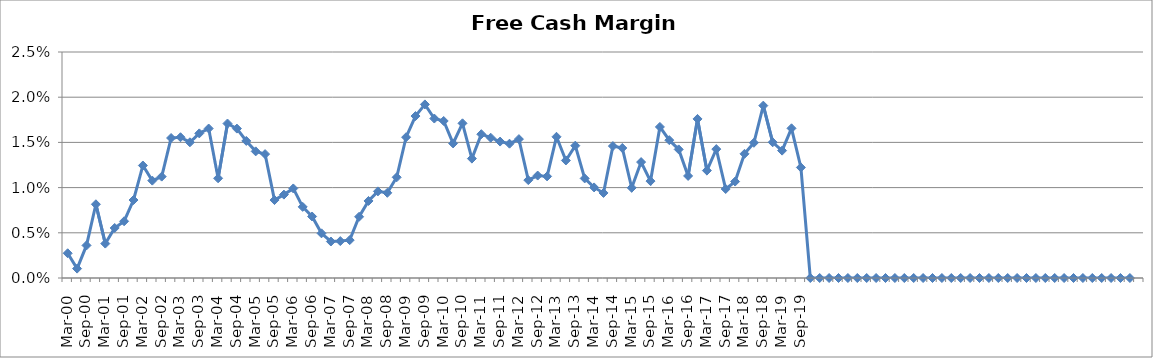
| Category | Revenue ($Millions) |
|---|---|
| Mar-00 | 0.003 |
| Jun-00 | 0.001 |
| Sep-00 | 0.004 |
| Dec-00 | 0.008 |
| Mar-01 | 0.004 |
| Jun-01 | 0.006 |
| Sep-01 | 0.006 |
| Dec-01 | 0.009 |
| Mar-02 | 0.012 |
| Jun-02 | 0.011 |
| Sep-02 | 0.011 |
| Dec-02 | 0.015 |
| Mar-03 | 0.016 |
| Jun-03 | 0.015 |
| Sep-03 | 0.016 |
| Dec-03 | 0.017 |
| Mar-04 | 0.011 |
| Jun-04 | 0.017 |
| Sep-04 | 0.017 |
| Dec-04 | 0.015 |
| Mar-05 | 0.014 |
| Jun-05 | 0.014 |
| Sep-05 | 0.009 |
| Dec-05 | 0.009 |
| Mar-06 | 0.01 |
| Jun-06 | 0.008 |
| Sep-06 | 0.007 |
| Dec-06 | 0.005 |
| Mar-07 | 0.004 |
| Jun-07 | 0.004 |
| Sep-07 | 0.004 |
| Dec-07 | 0.007 |
| Mar-08 | 0.009 |
| Jun-08 | 0.01 |
| Sep-08 | 0.009 |
| Dec-08 | 0.011 |
| Mar-09 | 0.016 |
| Jun-09 | 0.018 |
| Sep-09 | 0.019 |
| Dec-09 | 0.018 |
| Mar-10 | 0.017 |
| Jun-10 | 0.015 |
| Sep-10 | 0.017 |
| Dec-10 | 0.013 |
| Mar-11 | 0.016 |
| Jun-11 | 0.016 |
| Sep-11 | 0.015 |
| Dec-11 | 0.015 |
| Mar-12 | 0.015 |
| Jun-12 | 0.011 |
| Sep-12 | 0.011 |
| Dec-12 | 0.011 |
| Mar-13 | 0.016 |
| Jun-13 | 0.013 |
| Sep-13 | 0.015 |
| Dec-13 | 0.011 |
| Mar-14 | 0.01 |
| Jun-14 | 0.009 |
| Sep-14 | 0.015 |
| Dec-14 | 0.014 |
| Mar-15 | 0.01 |
| Jun-15 | 0.013 |
| Sep-15 | 0.011 |
| Dec-15 | 0.017 |
| Mar-16 | 0.015 |
| Jun-16 | 0.014 |
| Sep-16 | 0.011 |
| Dec-16 | 0.018 |
| Mar-17 | 0.012 |
| Jun-17 | 0.014 |
| Sep-17 | 0.01 |
| Dec-17 | 0.011 |
| Mar-18 | 0.014 |
| Jun-18 | 0.015 |
| Sep-18 | 0.019 |
| Dec-18 | 0.015 |
| Mar-19 | 0.014 |
| Jun-19 | 0.017 |
| Sep-19 | 0.012 |